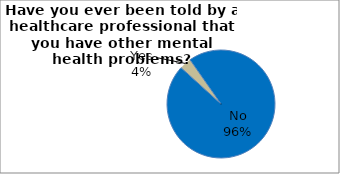
| Category | Series 0 |
|---|---|
| No | 96.475 |
| Yes | 3.525 |